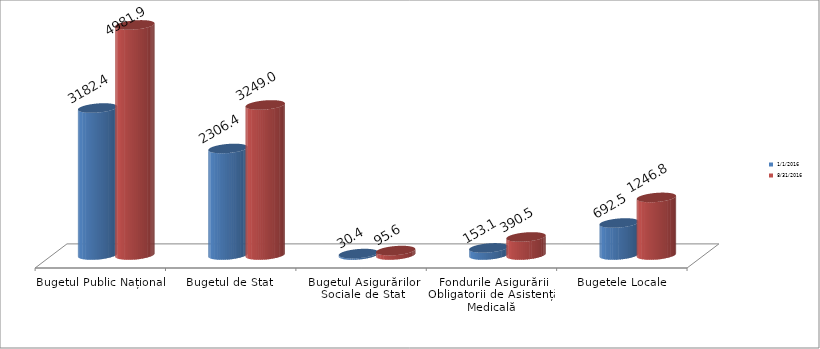
| Category | 01.01.2016 | 31.08.2016 |
|---|---|---|
| Bugetul Public Național | 3182.4 | 4981.9 |
| Bugetul de Stat | 2306.4 | 3249 |
| Bugetul Asigurărilor Sociale de Stat | 30.4 | 95.6 |
| Fondurile Asigurării Obligatorii de Asistență Medicală | 153.1 | 390.5 |
| Bugetele Locale | 692.5 | 1246.8 |